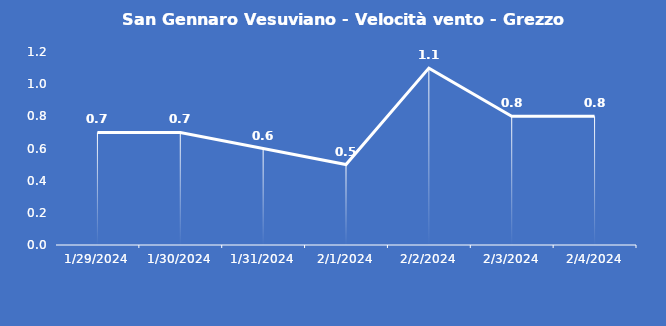
| Category | San Gennaro Vesuviano - Velocità vento - Grezzo (m/s) |
|---|---|
| 1/29/24 | 0.7 |
| 1/30/24 | 0.7 |
| 1/31/24 | 0.6 |
| 2/1/24 | 0.5 |
| 2/2/24 | 1.1 |
| 2/3/24 | 0.8 |
| 2/4/24 | 0.8 |